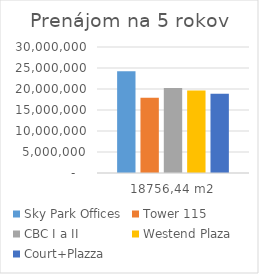
| Category | Sky Park Offices | Tower 115 | CBC I a II | Westend Plaza | Court+Plazza |
|---|---|---|---|---|---|
| 18756,44 m2 | 24213034.8 | 17924349.168 | 20257952.88 | 19646090.592 | 18856490.592 |